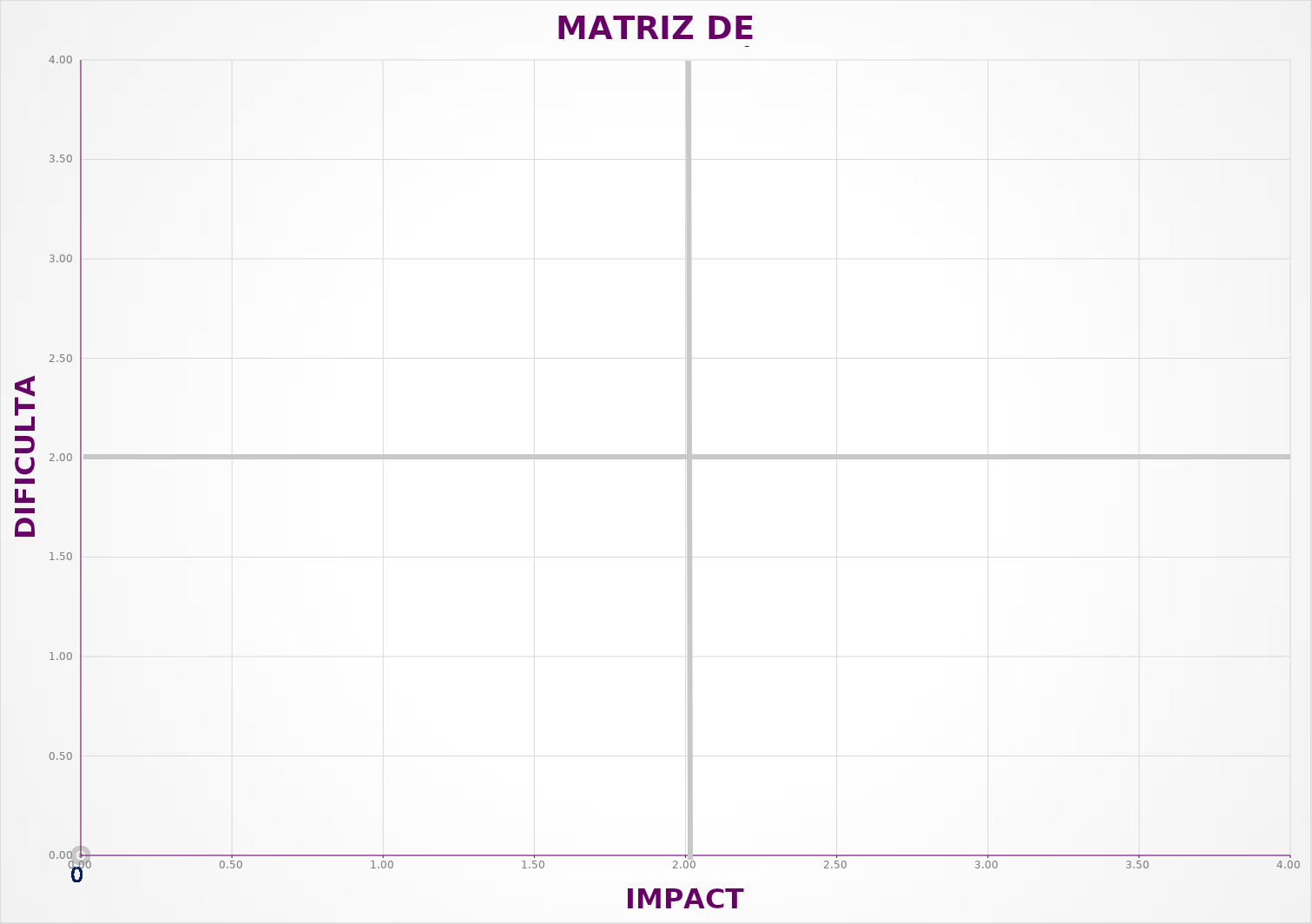
| Category | Series 0 |
|---|---|
| 0.0 | 2.31 |
| 0.0 | 2.31 |
| 0.0 | 2.31 |
| 0.0 | 2.31 |
| 0.0 | 2.31 |
| 0.0 | 0 |
| 0.0 | 0 |
| 0.0 | 0 |
| 0.0 | 0 |
| 0.0 | 0 |
| 0.0 | 0 |
| 0.0 | 0 |
| 0.0 | 0 |
| 0.0 | 0 |
| 0.0 | 0 |
| 0.0 | 0 |
| 0.0 | 0 |
| 0.0 | 0 |
| 0.0 | 0 |
| 0.0 | 0 |
| 0.0 | 0 |
| 0.0 | 0 |
| 0.0 | 0 |
| 0.0 | 0 |
| 0.0 | 0 |
| 0.0 | 0 |
| 0.0 | 0 |
| 0.0 | 0 |
| 0.0 | 0 |
| 0.0 | 0 |
| 0.0 | 0 |
| 0.0 | 0 |
| 0.0 | 0 |
| 0.0 | 0 |
| 0.0 | 0 |
| 0.0 | 0 |
| 0.0 | 0 |
| 0.0 | 0 |
| 0.0 | 0 |
| 0.0 | 0 |
| 0.0 | 0 |
| 0.0 | 0 |
| 0.0 | 0 |
| 0.0 | 0 |
| 0.0 | 0 |
| 0.0 | 0 |
| 0.0 | 0 |
| 0.0 | 0 |
| 0.0 | 0 |
| 0.0 | 0 |
| 0.0 | 0 |
| 0.0 | 0 |
| 0.0 | 0 |
| 0.0 | 0 |
| 0.0 | 0 |
| 0.0 | 0 |
| 0.0 | 0 |
| 0.0 | 0 |
| 0.0 | 0 |
| 0.0 | 0 |
| 0.0 | 0 |
| 0.0 | 0 |
| 0.0 | 0 |
| 0.0 | 0 |
| 0.0 | 0 |
| 0.0 | 0 |
| 0.0 | 0 |
| 0.0 | 0 |
| 0.0 | 0 |
| 0.0 | 0 |
| 0.0 | 0 |
| 0.0 | 0 |
| 0.0 | 0 |
| 0.0 | 0 |
| 0.0 | 0 |
| 0.0 | 0 |
| 0.0 | 0 |
| 0.0 | 0 |
| 0.0 | 0 |
| 0.0 | 0 |
| 0.0 | 0 |
| 0.0 | 0 |
| 0.0 | 0 |
| 0.0 | 0 |
| 0.0 | 0 |
| 0.0 | 0 |
| 0.0 | 0 |
| 0.0 | 0 |
| 0.0 | 0 |
| 0.0 | 0 |
| 0.0 | 0 |
| 0.0 | 0 |
| 0.0 | 0 |
| 0.0 | 0 |
| 0.0 | 0 |
| 0.0 | 0 |
| 0.0 | 0 |
| 0.0 | 0 |
| 0.0 | 0 |
| 0.0 | 0 |
| 0.0 | 0 |
| 0.0 | 0 |
| 0.0 | 0 |
| 0.0 | 0 |
| 0.0 | 0 |
| 0.0 | 0 |
| 0.0 | 0 |
| 0.0 | 0 |
| 0.0 | 0 |
| 0.0 | 0 |
| 0.0 | 0 |
| 0.0 | 0 |
| 0.0 | 0 |
| 0.0 | 0 |
| 0.0 | 0 |
| 0.0 | 0 |
| 0.0 | 0 |
| 0.0 | 0 |
| 0.0 | 0 |
| 0.0 | 0 |
| 0.0 | 0 |
| 0.0 | 0 |
| 0.0 | 0 |
| 0.0 | 0 |
| 0.0 | 0 |
| 0.0 | 0 |
| 0.0 | 0 |
| 0.0 | 0 |
| 0.0 | 0 |
| 0.0 | 0 |
| 0.0 | 0 |
| 0.0 | 0 |
| 0.0 | 0 |
| 0.0 | 0 |
| 0.0 | 0 |
| 0.0 | 0 |
| 0.0 | 0 |
| 0.0 | 0 |
| 0.0 | 0 |
| 0.0 | 0 |
| 0.0 | 0 |
| 0.0 | 0 |
| 0.0 | 0 |
| 0.0 | 0 |
| 0.0 | 0 |
| 0.0 | 0 |
| 0.0 | 0 |
| 0.0 | 0 |
| 0.0 | 0 |
| 0.0 | 0 |
| 0.0 | 0 |
| 0.0 | 0 |
| 0.0 | 0 |
| 0.0 | 0 |
| 0.0 | 0 |
| 0.0 | 0 |
| 0.0 | 0 |
| 0.0 | 0 |
| 0.0 | 0 |
| 0.0 | 0 |
| 0.0 | 0 |
| 0.0 | 0 |
| 0.0 | 0 |
| 0.0 | 0 |
| 0.0 | 0 |
| 0.0 | 0 |
| 0.0 | 0 |
| 0.0 | 0 |
| 0.0 | 0 |
| 0.0 | 0 |
| 0.0 | 0 |
| 0.0 | 0 |
| 0.0 | 0 |
| 0.0 | 0 |
| 0.0 | 0 |
| 0.0 | 0 |
| 0.0 | 0 |
| 0.0 | 0 |
| 0.0 | 0 |
| 0.0 | 0 |
| 0.0 | 0 |
| 0.0 | 0 |
| 0.0 | 0 |
| 0.0 | 0 |
| 0.0 | 0 |
| 0.0 | 0 |
| 0.0 | 0 |
| 0.0 | 0 |
| 0.0 | 0 |
| 0.0 | 0 |
| 0.0 | 0 |
| 0.0 | 0 |
| 0.0 | 0 |
| 0.0 | 0 |
| 0.0 | 0 |
| 0.0 | 0 |
| 0.0 | 0 |
| 0.0 | 0 |
| 0.0 | 0 |
| 0.0 | 0 |
| 0.0 | 0 |
| 0.0 | 0 |
| 0.0 | 0 |
| 0.0 | 0 |
| 0.0 | 0 |
| 0.0 | 0 |
| 0.0 | 0 |
| 0.0 | 0 |
| 0.0 | 0 |
| 0.0 | 0 |
| 0.0 | 0 |
| 0.0 | 0 |
| 0.0 | 0 |
| 0.0 | 0 |
| 0.0 | 0 |
| 0.0 | 0 |
| 0.0 | 0 |
| 0.0 | 0 |
| 0.0 | 0 |
| 0.0 | 0 |
| 0.0 | 0 |
| 0.0 | 0 |
| 0.0 | 0 |
| 0.0 | 0 |
| 0.0 | 0 |
| 0.0 | 0 |
| 0.0 | 0 |
| 0.0 | 0 |
| 0.0 | 0 |
| 0.0 | 0 |
| 0.0 | 0 |
| 0.0 | 0 |
| 0.0 | 0 |
| 0.0 | 0 |
| 0.0 | 0 |
| 0.0 | 0 |
| 0.0 | 0 |
| 0.0 | 0 |
| 0.0 | 0 |
| 0.0 | 0 |
| 0.0 | 0 |
| 0.0 | 0 |
| 0.0 | 0 |
| 0.0 | 0 |
| 0.0 | 0 |
| 0.0 | 0 |
| 0.0 | 0 |
| 0.0 | 0 |
| 0.0 | 0 |
| 0.0 | 0 |
| 0.0 | 0 |
| 0.0 | 0 |
| 0.0 | 0 |
| 0.0 | 0 |
| 0.0 | 0 |
| 0.0 | 0 |
| 0.0 | 0 |
| 0.0 | 0 |
| 0.0 | 0 |
| 0.0 | 0 |
| 0.0 | 0 |
| 0.0 | 0 |
| 0.0 | 0 |
| 0.0 | 0 |
| 0.0 | 0 |
| 0.0 | 0 |
| 0.0 | 0 |
| 0.0 | 0 |
| 0.0 | 0 |
| 0.0 | 0 |
| 0.0 | 0 |
| 0.0 | 0 |
| 0.0 | 0 |
| 0.0 | 0 |
| 0.0 | 0 |
| 0.0 | 0 |
| 0.0 | 0 |
| 0.0 | 0 |
| 0.0 | 0 |
| 0.0 | 0 |
| 0.0 | 0 |
| 0.0 | 0 |
| 0.0 | 0 |
| 0.0 | 0 |
| 0.0 | 0 |
| 0.0 | 0 |
| 0.0 | 0 |
| 0.0 | 0 |
| 0.0 | 0 |
| 0.0 | 0 |
| 0.0 | 0 |
| 0.0 | 0 |
| 0.0 | 0 |
| 0.0 | 0 |
| 0.0 | 0 |
| 0.0 | 0 |
| 0.0 | 0 |
| 0.0 | 0 |
| 0.0 | 0 |
| 0.0 | 0 |
| 0.0 | 0 |
| 0.0 | 0 |
| 0.0 | 0 |
| 0.0 | 0 |
| 0.0 | 0 |
| 0.0 | 0 |
| 0.0 | 0 |
| 0.0 | 0 |
| 0.0 | 0 |
| 0.0 | 0 |
| 0.0 | 0 |
| 0.0 | 0 |
| 0.0 | 0 |
| 0.0 | 0 |
| 0.0 | 0 |
| 0.0 | 0 |
| 0.0 | 0 |
| 0.0 | 0 |
| 0.0 | 0 |
| 0.0 | 0 |
| 0.0 | 0 |
| 0.0 | 0 |
| 0.0 | 0 |
| 0.0 | 0 |
| 0.0 | 0 |
| 0.0 | 0 |
| 0.0 | 0 |
| 0.0 | 0 |
| 0.0 | 0 |
| 0.0 | 0 |
| 0.0 | 0 |
| 0.0 | 0 |
| 0.0 | 0 |
| 0.0 | 0 |
| 0.0 | 0 |
| 0.0 | 0 |
| 0.0 | 0 |
| 0.0 | 0 |
| 0.0 | 0 |
| 0.0 | 0 |
| 0.0 | 0 |
| 0.0 | 0 |
| 0.0 | 0 |
| 0.0 | 0 |
| 0.0 | 0 |
| 0.0 | 0 |
| 0.0 | 0 |
| 0.0 | 0 |
| 0.0 | 0 |
| 0.0 | 0 |
| 0.0 | 0 |
| 0.0 | 0 |
| 0.0 | 0 |
| 0.0 | 0 |
| 0.0 | 0 |
| 0.0 | 0 |
| 0.0 | 0 |
| 0.0 | 0 |
| 0.0 | 0 |
| 0.0 | 0 |
| 0.0 | 0 |
| 0.0 | 0 |
| 0.0 | 0 |
| 0.0 | 0 |
| 0.0 | 0 |
| 0.0 | 0 |
| 0.0 | 0 |
| 0.0 | 0 |
| 0.0 | 0 |
| 0.0 | 0 |
| 0.0 | 0 |
| 0.0 | 0 |
| 0.0 | 0 |
| 0.0 | 0 |
| 0.0 | 0 |
| 0.0 | 0 |
| 0.0 | 0 |
| 0.0 | 0 |
| 0.0 | 0 |
| 0.0 | 0 |
| 0.0 | 0 |
| 0.0 | 0 |
| 0.0 | 0 |
| 0.0 | 0 |
| 0.0 | 0 |
| 0.0 | 0 |
| 0.0 | 0 |
| 0.0 | 0 |
| 0.0 | 0 |
| 0.0 | 0 |
| 0.0 | 0 |
| 0.0 | 0 |
| 0.0 | 0 |
| 0.0 | 0 |
| 0.0 | 0 |
| 0.0 | 0 |
| 0.0 | 0 |
| 0.0 | 0 |
| 0.0 | 0 |
| 0.0 | 0 |
| 0.0 | 0 |
| 0.0 | 0 |
| 0.0 | 0 |
| 0.0 | 0 |
| 0.0 | 0 |
| 0.0 | 0 |
| 0.0 | 0 |
| 0.0 | 0 |
| 0.0 | 0 |
| 0.0 | 0 |
| 0.0 | 0 |
| 0.0 | 0 |
| 0.0 | 0 |
| 0.0 | 0 |
| 0.0 | 0 |
| 0.0 | 0 |
| 0.0 | 0 |
| 0.0 | 0 |
| 0.0 | 0 |
| 0.0 | 0 |
| 0.0 | 0 |
| 0.0 | 0 |
| 0.0 | 0 |
| 0.0 | 0 |
| 0.0 | 0 |
| 0.0 | 0 |
| 0.0 | 0 |
| 0.0 | 0 |
| 0.0 | 0 |
| 0.0 | 0 |
| 0.0 | 0 |
| 0.0 | 0 |
| 0.0 | 0 |
| 0.0 | 0 |
| 0.0 | 0 |
| 0.0 | 0 |
| 0.0 | 0 |
| 0.0 | 0 |
| 0.0 | 0 |
| 0.0 | 0 |
| 0.0 | 0 |
| 0.0 | 0 |
| 0.0 | 0 |
| 0.0 | 0 |
| 0.0 | 0 |
| 0.0 | 0 |
| 0.0 | 0 |
| 0.0 | 0 |
| 0.0 | 0 |
| 0.0 | 0 |
| 0.0 | 0 |
| 0.0 | 0 |
| 0.0 | 0 |
| 0.0 | 0 |
| 0.0 | 0 |
| 0.0 | 0 |
| 0.0 | 0 |
| 0.0 | 0 |
| 0.0 | 0 |
| 0.0 | 0 |
| 0.0 | 0 |
| 0.0 | 0 |
| 0.0 | 0 |
| 0.0 | 0 |
| 0.0 | 0 |
| 0.0 | 0 |
| 0.0 | 0 |
| 0.0 | 0 |
| 0.0 | 0 |
| 0.0 | 0 |
| 0.0 | 0 |
| 0.0 | 0 |
| 0.0 | 0 |
| 0.0 | 0 |
| 0.0 | 0 |
| 0.0 | 0 |
| 0.0 | 0 |
| 0.0 | 0 |
| 0.0 | 0 |
| 0.0 | 0 |
| 0.0 | 0 |
| 0.0 | 0 |
| 0.0 | 0 |
| 0.0 | 0 |
| 0.0 | 0 |
| 0.0 | 0 |
| 0.0 | 0 |
| 0.0 | 0 |
| 0.0 | 0 |
| 0.0 | 0 |
| 0.0 | 0 |
| 0.0 | 0 |
| 0.0 | 0 |
| 0.0 | 0 |
| 0.0 | 0 |
| 0.0 | 0 |
| 0.0 | 0 |
| 0.0 | 0 |
| 0.0 | 0 |
| 0.0 | 0 |
| 0.0 | 0 |
| 0.0 | 0 |
| 0.0 | 0 |
| 0.0 | 0 |
| 0.0 | 0 |
| 0.0 | 0 |
| 0.0 | 0 |
| 0.0 | 0 |
| 0.0 | 0 |
| 0.0 | 0 |
| 0.0 | 0 |
| 0.0 | 0 |
| 0.0 | 0 |
| 0.0 | 0 |
| 0.0 | 0 |
| 0.0 | 0 |
| 0.0 | 0 |
| 0.0 | 0 |
| 0.0 | 0 |
| 0.0 | 0 |
| 0.0 | 0 |
| 0.0 | 0 |
| 0.0 | 0 |
| 0.0 | 0 |
| 0.0 | 0 |
| 0.0 | 0 |
| 0.0 | 0 |
| 0.0 | 0 |
| 0.0 | 0 |
| 0.0 | 0 |
| 0.0 | 0 |
| 0.0 | 0 |
| 0.0 | 0 |
| 0.0 | 0 |
| 0.0 | 0 |
| 0.0 | 0 |
| 0.0 | 0 |
| 0.0 | 0 |
| 0.0 | 0 |
| 0.0 | 0 |
| 0.0 | 0 |
| 0.0 | 0 |
| 0.0 | 0 |
| 0.0 | 0 |
| 0.0 | 0 |
| 0.0 | 0 |
| 0.0 | 0 |
| 0.0 | 0 |
| 0.0 | 0 |
| 0.0 | 0 |
| 0.0 | 0 |
| 0.0 | 0 |
| 0.0 | 0 |
| 0.0 | 0 |
| 0.0 | 0 |
| 0.0 | 0 |
| 0.0 | 0 |
| 0.0 | 0 |
| 0.0 | 0 |
| 0.0 | 0 |
| 0.0 | 0 |
| 0.0 | 0 |
| 0.0 | 0 |
| 0.0 | 0 |
| 0.0 | 0 |
| 0.0 | 0 |
| 0.0 | 0 |
| 0.0 | 0 |
| 0.0 | 0 |
| 0.0 | 0 |
| 0.0 | 0 |
| 0.0 | 0 |
| 0.0 | 0 |
| 0.0 | 0 |
| 0.0 | 0 |
| 0.0 | 0 |
| 0.0 | 0 |
| 0.0 | 0 |
| 0.0 | 0 |
| 0.0 | 0 |
| 0.0 | 0 |
| 0.0 | 0 |
| 0.0 | 0 |
| 0.0 | 0 |
| 0.0 | 0 |
| 0.0 | 0 |
| 0.0 | 0 |
| 0.0 | 0 |
| 0.0 | 0 |
| 0.0 | 0 |
| 0.0 | 0 |
| 0.0 | 0 |
| 0.0 | 0 |
| 0.0 | 0 |
| 0.0 | 0 |
| 0.0 | 0 |
| 0.0 | 0 |
| 0.0 | 0 |
| 0.0 | 0 |
| 0.0 | 0 |
| 0.0 | 0 |
| 0.0 | 0 |
| 0.0 | 0 |
| 0.0 | 0 |
| 0.0 | 0 |
| 0.0 | 0 |
| 0.0 | 0 |
| 0.0 | 0 |
| 0.0 | 0 |
| 0.0 | 0 |
| 0.0 | 0 |
| 0.0 | 0 |
| 0.0 | 0 |
| 0.0 | 0 |
| 0.0 | 0 |
| 0.0 | 0 |
| 0.0 | 0 |
| 0.0 | 0 |
| 0.0 | 0 |
| 0.0 | 0 |
| 0.0 | 0 |
| 0.0 | 0 |
| 0.0 | 0 |
| 0.0 | 0 |
| 0.0 | 0 |
| 0.0 | 0 |
| 0.0 | 0 |
| 0.0 | 0 |
| 0.0 | 0 |
| 0.0 | 0 |
| 0.0 | 0 |
| 0.0 | 0 |
| 0.0 | 0 |
| 0.0 | 0 |
| 0.0 | 0 |
| 0.0 | 0 |
| 0.0 | 0 |
| 0.0 | 0 |
| 0.0 | 0 |
| 0.0 | 0 |
| 0.0 | 0 |
| 0.0 | 0 |
| 0.0 | 0 |
| 0.0 | 0 |
| 0.0 | 0 |
| 0.0 | 0 |
| 0.0 | 0 |
| 0.0 | 0 |
| 0.0 | 0 |
| 0.0 | 0 |
| 0.0 | 0 |
| 0.0 | 0 |
| 0.0 | 0 |
| 0.0 | 0 |
| 0.0 | 0 |
| 0.0 | 0 |
| 0.0 | 0 |
| 0.0 | 0 |
| 0.0 | 0 |
| 0.0 | 0 |
| 0.0 | 0 |
| 0.0 | 0 |
| 0.0 | 0 |
| 0.0 | 0 |
| 0.0 | 0 |
| 0.0 | 0 |
| 0.0 | 0 |
| 0.0 | 0 |
| 0.0 | 0 |
| 0.0 | 0 |
| 0.0 | 0 |
| 0.0 | 0 |
| 0.0 | 0 |
| 0.0 | 0 |
| 0.0 | 0 |
| 0.0 | 0 |
| 0.0 | 0 |
| 0.0 | 0 |
| 0.0 | 0 |
| 0.0 | 0 |
| 0.0 | 0 |
| 0.0 | 0 |
| 0.0 | 0 |
| 0.0 | 0 |
| 0.0 | 0 |
| 0.0 | 0 |
| 0.0 | 0 |
| 0.0 | 0 |
| 0.0 | 0 |
| 0.0 | 0 |
| 0.0 | 0 |
| 0.0 | 0 |
| 0.0 | 0 |
| 0.0 | 0 |
| 0.0 | 0 |
| 0.0 | 0 |
| 0.0 | 0 |
| 0.0 | 0 |
| 0.0 | 0 |
| 0.0 | 0 |
| 0.0 | 0 |
| 0.0 | 0 |
| 0.0 | 0 |
| 0.0 | 0 |
| 0.0 | 0 |
| 0.0 | 0 |
| 0.0 | 0 |
| 0.0 | 0 |
| 0.0 | 0 |
| 0.0 | 0 |
| 0.0 | 0 |
| 0.0 | 0 |
| 0.0 | 0 |
| 0.0 | 0 |
| 0.0 | 0 |
| 0.0 | 0 |
| 0.0 | 0 |
| 0.0 | 0 |
| 0.0 | 0 |
| 0.0 | 0 |
| 0.0 | 0 |
| 0.0 | 0 |
| 0.0 | 0 |
| 0.0 | 0 |
| 0.0 | 0 |
| 0.0 | 0 |
| 0.0 | 0 |
| 0.0 | 0 |
| 0.0 | 0 |
| 0.0 | 0 |
| 0.0 | 0 |
| 0.0 | 0 |
| 0.0 | 0 |
| 0.0 | 0 |
| 0.0 | 0 |
| 0.0 | 0 |
| 0.0 | 0 |
| 0.0 | 0 |
| 0.0 | 0 |
| 0.0 | 0 |
| 0.0 | 0 |
| 0.0 | 0 |
| 0.0 | 0 |
| 0.0 | 0 |
| 0.0 | 0 |
| 0.0 | 0 |
| 0.0 | 0 |
| 0.0 | 0 |
| 0.0 | 0 |
| 0.0 | 0 |
| 0.0 | 0 |
| 0.0 | 0 |
| 0.0 | 0 |
| 0.0 | 0 |
| 0.0 | 0 |
| 0.0 | 0 |
| 0.0 | 0 |
| 0.0 | 0 |
| 0.0 | 0 |
| 0.0 | 0 |
| 0.0 | 0 |
| 0.0 | 0 |
| 0.0 | 0 |
| 0.0 | 0 |
| 0.0 | 0 |
| 0.0 | 0 |
| 0.0 | 0 |
| 0.0 | 0 |
| 0.0 | 0 |
| 0.0 | 0 |
| 0.0 | 0 |
| 0.0 | 0 |
| 0.0 | 0 |
| 0.0 | 0 |
| 0.0 | 0 |
| 0.0 | 0 |
| 0.0 | 0 |
| 0.0 | 0 |
| 0.0 | 0 |
| 0.0 | 0 |
| 0.0 | 0 |
| 0.0 | 0 |
| 0.0 | 0 |
| 0.0 | 0 |
| 0.0 | 0 |
| 0.0 | 0 |
| 0.0 | 0 |
| 0.0 | 0 |
| 0.0 | 0 |
| 0.0 | 0 |
| 0.0 | 0 |
| 0.0 | 0 |
| 0.0 | 0 |
| 0.0 | 0 |
| 0.0 | 0 |
| 0.0 | 0 |
| 0.0 | 0 |
| 0.0 | 0 |
| 0.0 | 0 |
| 0.0 | 0 |
| 0.0 | 0 |
| 0.0 | 0 |
| 0.0 | 0 |
| 0.0 | 0 |
| 0.0 | 0 |
| 0.0 | 0 |
| 0.0 | 0 |
| 0.0 | 0 |